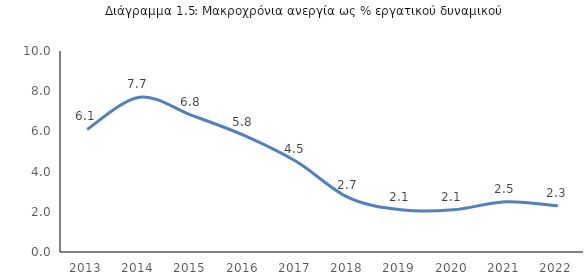
| Category |  >12 μήνες/εργατικό δυναμικό % |
|---|---|
| 2013.0 | 6.1 |
| 2014.0 | 7.7 |
| 2015.0 | 6.8 |
| 2016.0 | 5.8 |
| 2017.0 | 4.5 |
| 2018.0 | 2.7 |
| 2019.0 | 2.1 |
| 2020.0 | 2.1 |
| 2021.0 | 2.5 |
| 2022.0 | 2.3 |